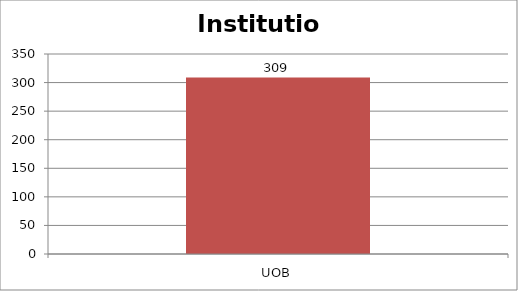
| Category | Institution |
|---|---|
| UOB | 309 |